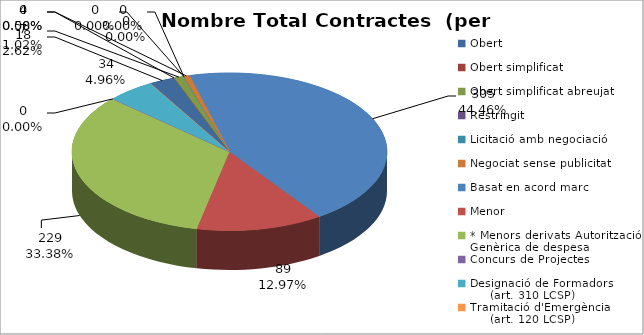
| Category | Nombre Total Contractes |
|---|---|
| Obert | 18 |
| Obert simplificat | 0 |
| Obert simplificat abreujat | 7 |
| Restringit | 0 |
| Licitació amb negociació | 0 |
| Negociat sense publicitat | 4 |
| Basat en acord marc | 305 |
| Menor | 89 |
| * Menors derivats Autorització Genèrica de despesa | 229 |
| Concurs de Projectes | 0 |
| Designació de Formadors
     (art. 310 LCSP) | 34 |
| Tramitació d'Emergència
     (art. 120 LCSP) | 0 |